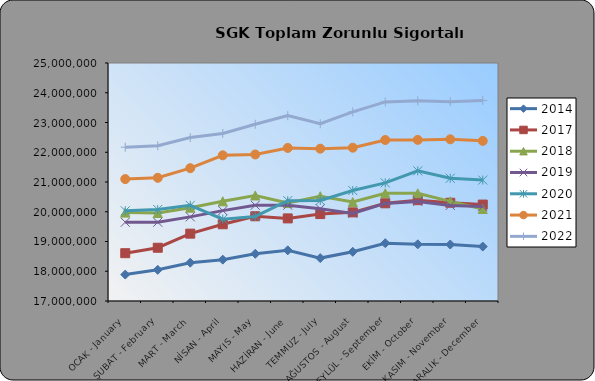
| Category | 2014 | 2017 | 2018 | 2019 | 2020 | 2021 | 2022 |
|---|---|---|---|---|---|---|---|
| OCAK - January | 17888850 | 18607120 | 19970763 | 19648900 | 20032004 | 21097678 | 22169405 |
| ŞUBAT - February | 18047588 | 18790237 | 19960009 | 19647886 | 20075675 | 21141033 | 22217148 |
| MART - March | 18287217 | 19263697 | 20137543 | 19828091 | 20214050 | 21464579 | 22492708 |
| NİSAN - April | 18390035 | 19579378 | 20351666 | 20038270 | 19752080 | 21896828 | 22631222 |
| MAYIS - May | 18587161 | 19847694 | 20547739 | 20218472 | 19843495 | 21925160 | 22940182 |
| HAZİRAN - June | 18703323 | 19775804 | 20292691 | 20220807 | 20373446 | 22144897 | 23231725 |
| TEMMUZ - July | 18442224 | 19922088 | 20523586 | 20102816 | 20380102 | 22120535 | 22959768 |
| AĞUSTOS - August | 18653931 | 19979268 | 20325317 | 19945604 | 20713606 | 22152695 | 23358191 |
| EYLÜL - September | 18942797 | 20284445 | 20621914 | 20279720 | 20970323 | 22412059 | 23692191 |
| EKİM - October | 18905822 | 20390228 | 20620417 | 20348058 | 21374683 | 22415773 | 23728691 |
| KASIM - November | 18898806 | 20302716 | 20349347 | 20213823 | 21125594 | 22434929 | 23701027 |
| ARALIK - December | 18829866 | 20241389 | 20093780 | 20172891 | 21064613 | 22382418 | 23741403 |